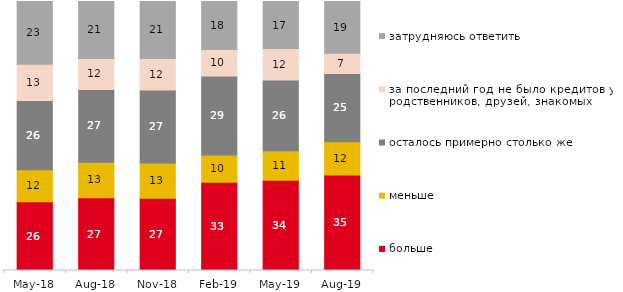
| Category | больше | меньше | осталось примерно столько же | за последний год не было кредитов у родственников, друзей, знакомых | затрудняюсь ответить |
|---|---|---|---|---|---|
| 2018-05-01 | 25.55 | 11.9 | 25.75 | 13.45 | 23.35 |
| 2018-08-01 | 27.05 | 13.2 | 27 | 11.6 | 21.15 |
| 2018-11-01 | 26.896 | 13.074 | 27.096 | 11.776 | 21.158 |
| 2019-02-01 | 32.8 | 10.1 | 29.45 | 9.8 | 17.85 |
| 2019-05-01 | 33.531 | 10.946 | 26.35 | 11.689 | 17.484 |
| 2019-08-01 | 35.465 | 12.438 | 25.375 | 7.443 | 19.281 |